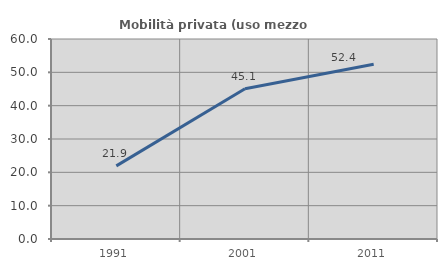
| Category | Mobilità privata (uso mezzo privato) |
|---|---|
| 1991.0 | 21.945 |
| 2001.0 | 45.095 |
| 2011.0 | 52.423 |